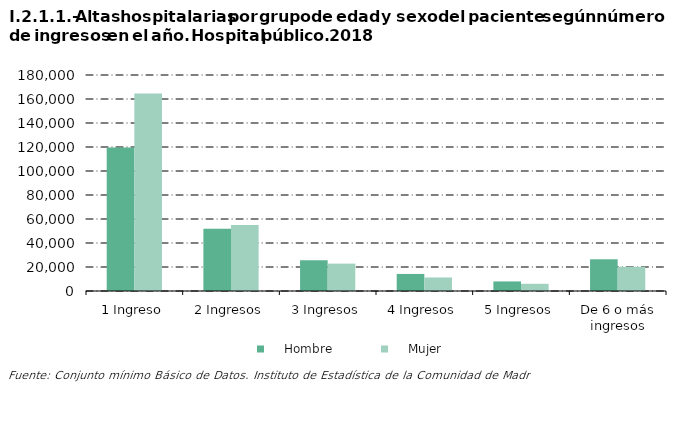
| Category |     Hombre |     Mujer |
|---|---|---|
| 1 Ingreso | 119633 | 164488 |
| 2 Ingresos | 51855 | 55066 |
| 3 Ingresos | 25629 | 22811 |
| 4 Ingresos | 14220 | 11285 |
| 5 Ingresos | 7966 | 5997 |
| De 6 o más ingresos | 26429 | 20166 |